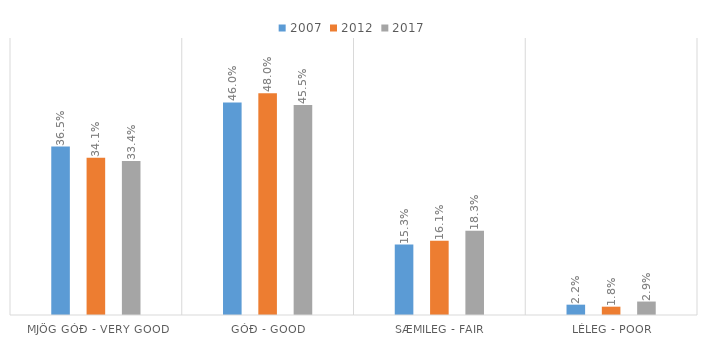
| Category | 2007 | 2012 | 2017 |
|---|---|---|---|
| Mjög góð - Very good | 0.365 | 0.341 | 0.334 |
| Góð - Good | 0.46 | 0.48 | 0.455 |
| Sæmileg - Fair | 0.153 | 0.161 | 0.183 |
| Léleg - Poor | 0.022 | 0.018 | 0.029 |